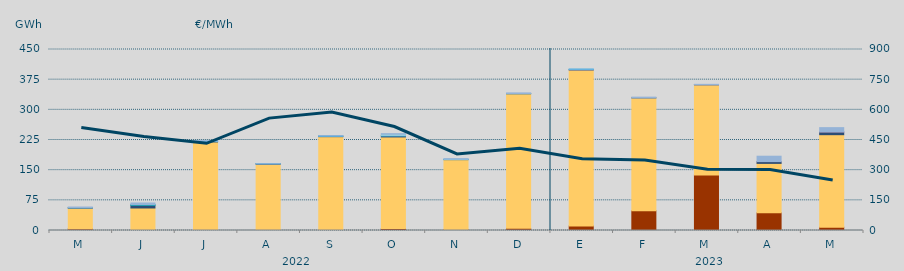
| Category | Carbón | Ciclo Combinado | Cogeneración | Consumo Bombeo | Enlace Península Baleares | Eólica | Hidráulica | Internacionales | Otras Renovables | Residuos no Renovables | Solar fotovoltaica | Solar térmica | Turbinación bombeo |
|---|---|---|---|---|---|---|---|---|---|---|---|---|---|
| M | 4151 | 51455.8 | 0 | 906.775 | 0 | 0 | 22.4 | 0 | 0 | 0 | 0 | 0 | 1817.044 |
| J | 865 | 55112.458 | 0 | 7229.298 | 0 | 0.5 | 1411.333 | 0 | 0 | 0 | 0 | 0 | 3733.801 |
| J | 60 | 220106.232 | 0 | 916.465 | 0 | 0 | 693.475 | 0 | 0 | 0 | 0 | 0 | 1555.3 |
| A | 115 | 164760.775 | 0 | 1020.576 | 102 | 0 | 100 | 0 | 0 | 0 | 0 | 0 | 81.25 |
| S | 555 | 232710.6 | 0 | 982.5 | 388.7 | 0 | 418.25 | 0 | 0 | 0 | 0 | 0 | 708.4 |
| O | 4836.8 | 227776.455 | 0 | 2792.6 | 0 | 0 | 208.75 | 3824.8 | 0 | 0 | 0 | 0 | 1365.5 |
| N | 2212.7 | 174006.854 | 0 | 126 | 0 | 0 | 449.2 | 613.333 | 0 | 0 | 0 | 0 | 1312.25 |
| D | 5478 | 334554.358 | 0 | 258.25 | 0 | 0 | 227.925 | 0 | 0 | 0 | 0 | 0 | 1594.663 |
| E | 11268 | 387716.675 | 0 | 572.573 | 681.8 | 0 | 835.85 | 0 | 0 | 0 | 0 | 0 | 77.5 |
| F | 48958 | 280733.853 | 0 | 43.033 | 0 | 0 | 0 | 0 | 0 | 0 | 0 | 0 | 1846.75 |
| M | 138130.4 | 224071.017 | 0 | 316.875 | 152.4 | 0 | 0 | 0 | 0 | 0 | 0 | 0 | 717.667 |
| A | 43920 | 122955.6 | 0 | 4435.017 | 148.1 | 0 | 0 | 0 | 0 | 0 | 0 | 0 | 13251.877 |
| M | 8172.8 | 230037.608 | 0 | 6374.2 | 1318.3 | 0 | 0 | 0 | 0 | 0 | 0 | 0 | 9849.292 |